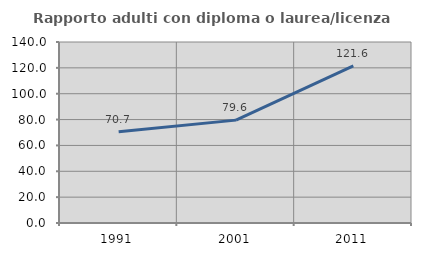
| Category | Rapporto adulti con diploma o laurea/licenza media  |
|---|---|
| 1991.0 | 70.652 |
| 2001.0 | 79.57 |
| 2011.0 | 121.615 |